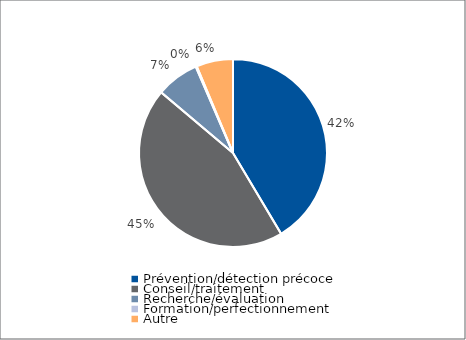
| Category | Series 0 |
|---|---|
| Prévention/détection précoce | 73827 |
| Conseil/traitement | 79629 |
| Recherche/évaluation | 13103 |
| Formation/perfectionnement | 326 |
| Autre | 11225 |